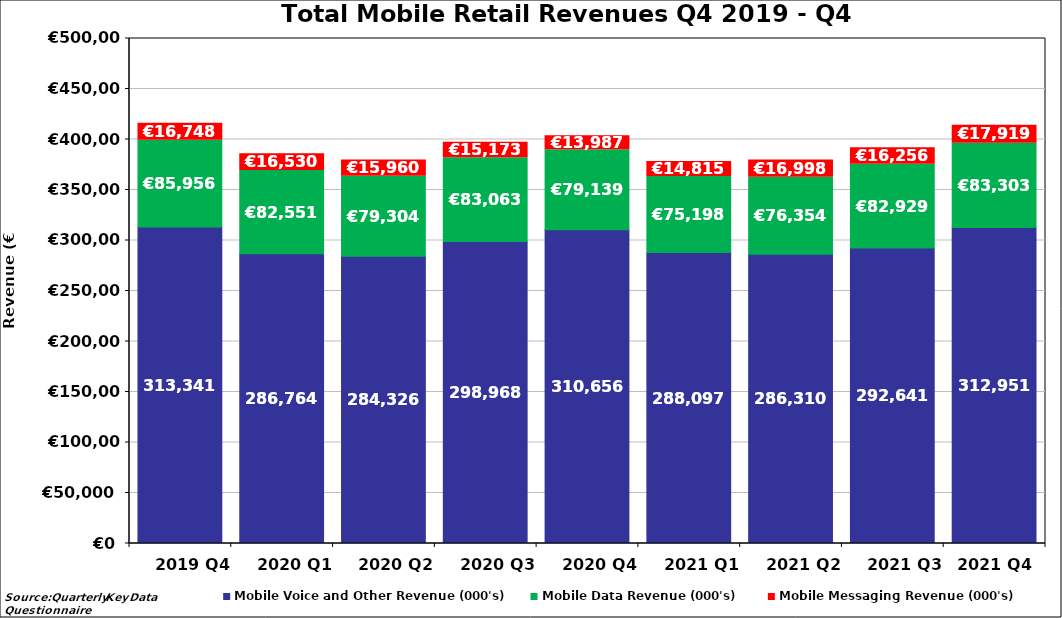
| Category | Mobile Voice and Other Revenue (000's) | Mobile Data Revenue (000's) | Mobile Messaging Revenue (000's) |
|---|---|---|---|
| 2019 Q4 | 313340.616 | 85955.659 | 16747.708 |
| 2020 Q1 | 286764 | 82551 | 16530.453 |
| 2020 Q2 | 284326.22 | 79304 | 15960 |
| 2020 Q3 | 298968.438 | 83063 | 15173 |
| 2020 Q4 | 310656.203 | 79139.116 | 13986.661 |
| 2021 Q1 | 288097.194 | 75197.694 | 14815.333 |
| 2021 Q2 | 286310.246 | 76354.443 | 16997.711 |
| 2021 Q3 | 292641 | 82928.975 | 16255.741 |
| 2021 Q4  | 312951.097 | 83303.487 | 17918.83 |